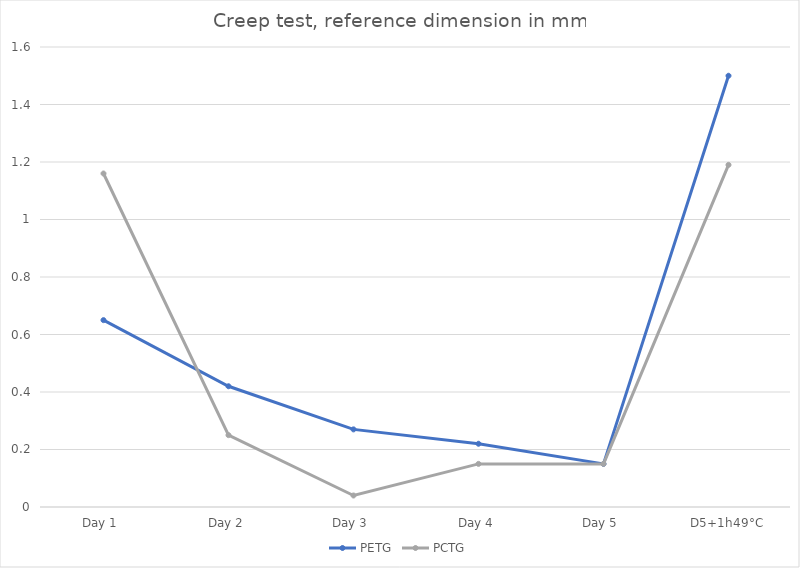
| Category | PETG | PCTG |
|---|---|---|
| Day 1 | 0.65 | 1.16 |
| Day 2 | 0.42 | 0.25 |
| Day 3 | 0.27 | 0.04 |
| Day 4 | 0.22 | 0.15 |
| Day 5 | 0.15 | 0.15 |
| D5+1h49°C | 1.5 | 1.19 |